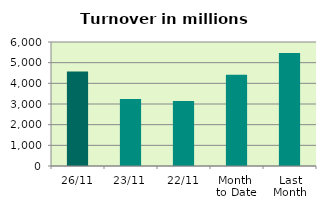
| Category | Series 0 |
|---|---|
| 26/11 | 4572.805 |
| 23/11 | 3236.294 |
| 22/11 | 3141.906 |
| Month 
to Date | 4416.709 |
| Last
Month | 5472.473 |